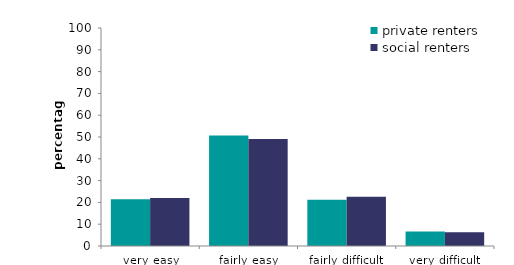
| Category | private renters | social renters |
|---|---|---|
| very easy | 21.492 | 21.994 |
| fairly easy | 50.632 | 49.06 |
| fairly difficult | 21.173 | 22.606 |
| very difficult | 6.703 | 6.34 |